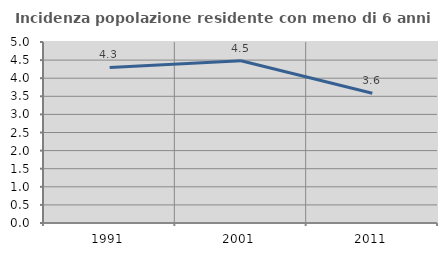
| Category | Incidenza popolazione residente con meno di 6 anni |
|---|---|
| 1991.0 | 4.298 |
| 2001.0 | 4.48 |
| 2011.0 | 3.585 |